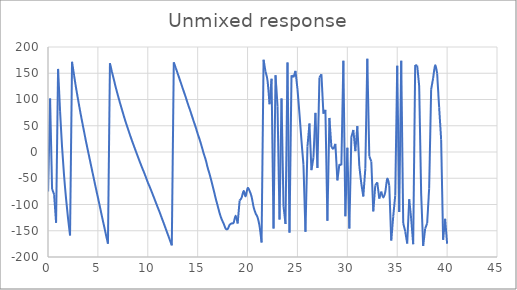
| Category | Series 0 |
|---|---|
| 0.01 | -75.169 |
| 0.20995 | 101.948 |
| 0.4099 | -70.43 |
| 0.60985 | -80.579 |
| 0.8098 | -134.649 |
| 1.00975 | 158.306 |
| 1.2097 | 77.784 |
| 1.40965 | 9.516 |
| 1.6096 | -44.796 |
| 1.80955 | -88.809 |
| 2.0095 | -126.266 |
| 2.20945 | -158.972 |
| 2.4094 | 171.735 |
| 2.60935 | 146.421 |
| 2.8093 | 122.249 |
| 3.00925 | 100.302 |
| 3.2092 | 78.877 |
| 3.40915 | 58.861 |
| 3.6091 | 39.356 |
| 3.80905 | 20.049 |
| 4.009 | 1.8 |
| 4.20895 | -16.251 |
| 4.4089 | -34.223 |
| 4.60885 | -52.158 |
| 4.8088 | -69.921 |
| 5.00875 | -87.151 |
| 5.2087 | -104.777 |
| 5.40865 | -122.88 |
| 5.6086 | -140.101 |
| 5.80855 | -157.591 |
| 6.0085 | -174.622 |
| 6.20845 | 169.105 |
| 6.4084 | 152.353 |
| 6.60835 | 137.323 |
| 6.8083 | 121.834 |
| 7.00825 | 107.657 |
| 7.2082 | 93.957 |
| 7.40815 | 80.986 |
| 7.6081 | 68.044 |
| 7.80805 | 55.735 |
| 8.008 | 44.467 |
| 8.20795 | 33.079 |
| 8.4079 | 22.021 |
| 8.60785 | 11.641 |
| 8.8078 | 1.257 |
| 9.00775 | -8.919 |
| 9.2077 | -18.989 |
| 9.40765 | -28.754 |
| 9.6076 | -38.073 |
| 9.80755 | -47.805 |
| 10.0075 | -58.156 |
| 10.20745 | -66.922 |
| 10.4074 | -76.525 |
| 10.60735 | -86.233 |
| 10.8073 | -96.168 |
| 11.00725 | -105.925 |
| 11.2072 | -115.559 |
| 11.40715 | -125.966 |
| 11.6071 | -136.059 |
| 11.80705 | -146.472 |
| 12.007 | -156.874 |
| 12.20695 | -167.329 |
| 12.4069 | -177.845 |
| 12.60685 | 170.76 |
| 12.8068 | 159.918 |
| 13.00675 | 149.038 |
| 13.2067 | 137.717 |
| 13.40665 | 126.603 |
| 13.6066 | 115.363 |
| 13.80655 | 104.161 |
| 14.0065 | 92.317 |
| 14.20645 | 81.318 |
| 14.4064 | 69.835 |
| 14.60635 | 58.293 |
| 14.8063 | 46.955 |
| 15.00625 | 34.525 |
| 15.2062 | 23.282 |
| 15.40615 | 10.515 |
| 15.6061 | -2.957 |
| 15.80605 | -14.964 |
| 16.006 | -30.083 |
| 16.20595 | -42.918 |
| 16.4059 | -57.417 |
| 16.60585 | -72.372 |
| 16.8058 | -88.347 |
| 17.00575 | -102.579 |
| 17.2057 | -116.837 |
| 17.40565 | -128.112 |
| 17.6056 | -136.37 |
| 17.80555 | -145.779 |
| 18.0055 | -146.702 |
| 18.20545 | -138.711 |
| 18.4054 | -136.02 |
| 18.60535 | -134.716 |
| 18.8053 | -121.333 |
| 19.00525 | -136.124 |
| 19.2052 | -92.446 |
| 19.40515 | -86.969 |
| 19.6051 | -74.136 |
| 19.80505 | -84.382 |
| 20.005 | -68.787 |
| 20.20495 | -74.247 |
| 20.4049 | -85.189 |
| 20.60485 | -104.761 |
| 20.8048 | -116.702 |
| 21.00475 | -124.47 |
| 21.2047 | -141.509 |
| 21.40465 | -172.284 |
| 21.6046 | 175.716 |
| 21.80455 | 152.621 |
| 22.0045 | 135.643 |
| 22.20445 | 90.979 |
| 22.4044 | 139.613 |
| 22.60435 | -145.886 |
| 22.8043 | 146.171 |
| 23.00425 | 87.138 |
| 23.2042 | -128.442 |
| 23.40415 | 101.741 |
| 23.6041 | -103.171 |
| 23.80405 | -137.142 |
| 24.004 | 170.621 |
| 24.20395 | -153.559 |
| 24.4039 | 146.002 |
| 24.60385 | 142.311 |
| 24.8038 | 154.51 |
| 25.00375 | 119.669 |
| 25.2037 | 72.466 |
| 25.40365 | 21.941 |
| 25.6036 | -24.643 |
| 25.80355 | -152.067 |
| 26.0035 | 10.258 |
| 26.20345 | 54.205 |
| 26.4034 | -34.576 |
| 26.60335 | -10.806 |
| 26.8033 | 74.548 |
| 27.00325 | -30.436 |
| 27.2032 | 141.813 |
| 27.40315 | 148.012 |
| 27.6031 | 72.932 |
| 27.80305 | 80.249 |
| 28.003 | -130.994 |
| 28.20295 | 64.947 |
| 28.4029 | 9.583 |
| 28.60285 | 5.224 |
| 28.8028 | 15.433 |
| 29.00275 | -54.107 |
| 29.2027 | -23.419 |
| 29.40265 | -25.194 |
| 29.6026 | 173.648 |
| 29.80255 | -122.295 |
| 30.0025 | 7.995 |
| 30.20245 | -145.853 |
| 30.4024 | 28.311 |
| 30.60235 | 42.03 |
| 30.8023 | 1.643 |
| 31.00225 | 49.232 |
| 31.2022 | -26.83 |
| 31.40215 | -60.003 |
| 31.6021 | -84.722 |
| 31.80205 | -31.656 |
| 32.002 | 177.691 |
| 32.20195 | -8.175 |
| 32.4019 | -18.097 |
| 32.60185 | -113.109 |
| 32.8018 | -63.636 |
| 33.00175 | -57.859 |
| 33.2017 | -88.776 |
| 33.40165 | -75.396 |
| 33.6016 | -86.596 |
| 33.80155 | -76.246 |
| 34.0015 | -50.96 |
| 34.20145 | -63.411 |
| 34.4014 | -168.692 |
| 34.60135 | -122.45 |
| 34.8013 | -82.559 |
| 35.00125 | 164.113 |
| 35.2012 | -114.223 |
| 35.40115 | 173.702 |
| 35.6011 | -135.395 |
| 35.80105 | -151.014 |
| 36.001 | -174.394 |
| 36.20095 | -89.874 |
| 36.4009 | -127.498 |
| 36.60085 | -175.518 |
| 36.8008 | 165.569 |
| 37.00075 | 164.803 |
| 37.2007 | 125.755 |
| 37.40065 | -80.062 |
| 37.6006 | -178.937 |
| 37.80055 | -145.947 |
| 38.0005 | -135.759 |
| 38.20045 | -68.982 |
| 38.4004 | 119.351 |
| 38.60035 | 140.753 |
| 38.8003 | 164.854 |
| 39.00025 | 150.025 |
| 39.2002 | 85.318 |
| 39.40015 | 24.484 |
| 39.6001 | -167.309 |
| 39.80005 | -127.286 |
| 40.0 | -174.635 |
| 40.0 | -174.635 |
| 40.0 | -174.635 |
| 40.0 | -174.635 |
| 40.0 | -174.635 |
| 40.0 | -174.635 |
| 40.0 | -174.635 |
| 40.0 | -174.635 |
| 40.0 | -174.635 |
| 40.0 | -174.635 |
| 40.0 | -174.635 |
| 40.0 | -174.635 |
| 40.0 | -174.635 |
| 40.0 | -174.635 |
| 40.0 | -174.635 |
| 40.0 | -174.635 |
| 40.0 | -174.635 |
| 40.0 | -174.635 |
| 40.0 | -174.635 |
| 40.0 | -174.635 |
| 40.0 | -174.635 |
| 40.0 | -174.635 |
| 40.0 | -174.635 |
| 40.0 | -174.635 |
| 40.0 | -174.635 |
| 40.0 | -174.635 |
| 40.0 | -174.635 |
| 40.0 | -174.635 |
| 40.0 | -174.635 |
| 40.0 | -174.635 |
| 40.0 | -174.635 |
| 40.0 | -174.635 |
| 40.0 | -174.635 |
| 40.0 | -174.635 |
| 40.0 | -174.635 |
| 40.0 | -174.635 |
| 40.0 | -174.635 |
| 40.0 | -174.635 |
| 40.0 | -174.635 |
| 40.0 | -174.635 |
| 40.0 | -174.635 |
| 40.0 | -174.635 |
| 40.0 | -174.635 |
| 40.0 | -174.635 |
| 40.0 | -174.635 |
| 40.0 | -174.635 |
| 40.0 | -174.635 |
| 40.0 | -174.635 |
| 40.0 | -174.635 |
| 40.0 | -174.635 |
| 40.0 | -174.635 |
| 40.0 | -174.635 |
| 40.0 | -174.635 |
| 40.0 | -174.635 |
| 40.0 | -174.635 |
| 40.0 | -174.635 |
| 40.0 | -174.635 |
| 40.0 | -174.635 |
| 40.0 | -174.635 |
| 40.0 | -174.635 |
| 40.0 | -174.635 |
| 40.0 | -174.635 |
| 40.0 | -174.635 |
| 40.0 | -174.635 |
| 40.0 | -174.635 |
| 40.0 | -174.635 |
| 40.0 | -174.635 |
| 40.0 | -174.635 |
| 40.0 | -174.635 |
| 40.0 | -174.635 |
| 40.0 | -174.635 |
| 40.0 | -174.635 |
| 40.0 | -174.635 |
| 40.0 | -174.635 |
| 40.0 | -174.635 |
| 40.0 | -174.635 |
| 40.0 | -174.635 |
| 40.0 | -174.635 |
| 40.0 | -174.635 |
| 40.0 | -174.635 |
| 40.0 | -174.635 |
| 40.0 | -174.635 |
| 40.0 | -174.635 |
| 40.0 | -174.635 |
| 40.0 | -174.635 |
| 40.0 | -174.635 |
| 40.0 | -174.635 |
| 40.0 | -174.635 |
| 40.0 | -174.635 |
| 40.0 | -174.635 |
| 40.0 | -174.635 |
| 40.0 | -174.635 |
| 40.0 | -174.635 |
| 40.0 | -174.635 |
| 40.0 | -174.635 |
| 40.0 | -174.635 |
| 40.0 | -174.635 |
| 40.0 | -174.635 |
| 40.0 | -174.635 |
| 40.0 | -174.635 |
| 40.0 | -174.635 |
| 40.0 | -174.635 |
| 40.0 | -174.635 |
| 40.0 | -174.635 |
| 40.0 | -174.635 |
| 40.0 | -174.635 |
| 40.0 | -174.635 |
| 40.0 | -174.635 |
| 40.0 | -174.635 |
| 40.0 | -174.635 |
| 40.0 | -174.635 |
| 40.0 | -174.635 |
| 40.0 | -174.635 |
| 40.0 | -174.635 |
| 40.0 | -174.635 |
| 40.0 | -174.635 |
| 40.0 | -174.635 |
| 40.0 | -174.635 |
| 40.0 | -174.635 |
| 40.0 | -174.635 |
| 40.0 | -174.635 |
| 40.0 | -174.635 |
| 40.0 | -174.635 |
| 40.0 | -174.635 |
| 40.0 | -174.635 |
| 40.0 | -174.635 |
| 40.0 | -174.635 |
| 40.0 | -174.635 |
| 40.0 | -174.635 |
| 40.0 | -174.635 |
| 40.0 | -174.635 |
| 40.0 | -174.635 |
| 40.0 | -174.635 |
| 40.0 | -174.635 |
| 40.0 | -174.635 |
| 40.0 | -174.635 |
| 40.0 | -174.635 |
| 40.0 | -174.635 |
| 40.0 | -174.635 |
| 40.0 | -174.635 |
| 40.0 | -174.635 |
| 40.0 | -174.635 |
| 40.0 | -174.635 |
| 40.0 | -174.635 |
| 40.0 | -174.635 |
| 40.0 | -174.635 |
| 40.0 | -174.635 |
| 40.0 | -174.635 |
| 40.0 | -174.635 |
| 40.0 | -174.635 |
| 40.0 | -174.635 |
| 40.0 | -174.635 |
| 40.0 | -174.635 |
| 40.0 | -174.635 |
| 40.0 | -174.635 |
| 40.0 | -174.635 |
| 40.0 | -174.635 |
| 40.0 | -174.635 |
| 40.0 | -174.635 |
| 40.0 | -174.635 |
| 40.0 | -174.635 |
| 40.0 | -174.635 |
| 40.0 | -174.635 |
| 40.0 | -174.635 |
| 40.0 | -174.635 |
| 40.0 | -174.635 |
| 40.0 | -174.635 |
| 40.0 | -174.635 |
| 40.0 | -174.635 |
| 40.0 | -174.635 |
| 40.0 | -174.635 |
| 40.0 | -174.635 |
| 40.0 | -174.635 |
| 40.0 | -174.635 |
| 40.0 | -174.635 |
| 40.0 | -174.635 |
| 40.0 | -174.635 |
| 40.0 | -174.635 |
| 40.0 | -174.635 |
| 40.0 | -174.635 |
| 40.0 | -174.635 |
| 40.0 | -174.635 |
| 40.0 | -174.635 |
| 40.0 | -174.635 |
| 40.0 | -174.635 |
| 40.0 | -174.635 |
| 40.0 | -174.635 |
| 40.0 | -174.635 |
| 40.0 | -174.635 |
| 40.0 | -174.635 |
| 40.0 | -174.635 |
| 40.0 | -174.635 |
| 40.0 | -174.635 |
| 40.0 | -174.635 |
| 40.0 | -174.635 |
| 40.0 | -174.635 |
| 40.0 | -174.635 |
| 40.0 | -174.635 |
| 40.0 | -174.635 |
| 40.0 | -174.635 |
| 40.0 | -174.635 |
| 40.0 | -174.635 |
| 40.0 | -174.635 |
| 40.0 | -174.635 |
| 40.0 | -174.635 |
| 40.0 | -174.635 |
| 40.0 | -174.635 |
| 40.0 | -174.635 |
| 40.0 | -174.635 |
| 40.0 | -174.635 |
| 40.0 | -174.635 |
| 40.0 | -174.635 |
| 40.0 | -174.635 |
| 40.0 | -174.635 |
| 40.0 | -174.635 |
| 40.0 | -174.635 |
| 40.0 | -174.635 |
| 40.0 | -174.635 |
| 40.0 | -174.635 |
| 40.0 | -174.635 |
| 40.0 | -174.635 |
| 40.0 | -174.635 |
| 40.0 | -174.635 |
| 40.0 | -174.635 |
| 40.0 | -174.635 |
| 40.0 | -174.635 |
| 40.0 | -174.635 |
| 40.0 | -174.635 |
| 40.0 | -174.635 |
| 40.0 | -174.635 |
| 40.0 | -174.635 |
| 40.0 | -174.635 |
| 40.0 | -174.635 |
| 40.0 | -174.635 |
| 40.0 | -174.635 |
| 40.0 | -174.635 |
| 40.0 | -174.635 |
| 40.0 | -174.635 |
| 40.0 | -174.635 |
| 40.0 | -174.635 |
| 40.0 | -174.635 |
| 40.0 | -174.635 |
| 40.0 | -174.635 |
| 40.0 | -174.635 |
| 40.0 | -174.635 |
| 40.0 | -174.635 |
| 40.0 | -174.635 |
| 40.0 | -174.635 |
| 40.0 | -174.635 |
| 40.0 | -174.635 |
| 40.0 | -174.635 |
| 40.0 | -174.635 |
| 40.0 | -174.635 |
| 40.0 | -174.635 |
| 40.0 | -174.635 |
| 40.0 | -174.635 |
| 40.0 | -174.635 |
| 40.0 | -174.635 |
| 40.0 | -174.635 |
| 40.0 | -174.635 |
| 40.0 | -174.635 |
| 40.0 | -174.635 |
| 40.0 | -174.635 |
| 40.0 | -174.635 |
| 40.0 | -174.635 |
| 40.0 | -174.635 |
| 40.0 | -174.635 |
| 40.0 | -174.635 |
| 40.0 | -174.635 |
| 40.0 | -174.635 |
| 40.0 | -174.635 |
| 40.0 | -174.635 |
| 40.0 | -174.635 |
| 40.0 | -174.635 |
| 40.0 | -174.635 |
| 40.0 | -174.635 |
| 40.0 | -174.635 |
| 40.0 | -174.635 |
| 40.0 | -174.635 |
| 40.0 | -174.635 |
| 40.0 | -174.635 |
| 40.0 | -174.635 |
| 40.0 | -174.635 |
| 40.0 | -174.635 |
| 40.0 | -174.635 |
| 40.0 | -174.635 |
| 40.0 | -174.635 |
| 40.0 | -174.635 |
| 40.0 | -174.635 |
| 40.0 | -174.635 |
| 40.0 | -174.635 |
| 40.0 | -174.635 |
| 40.0 | -174.635 |
| 40.0 | -174.635 |
| 40.0 | -174.635 |
| 40.0 | -174.635 |
| 40.0 | -174.635 |
| 40.0 | -174.635 |
| 40.0 | -174.635 |
| 40.0 | -174.635 |
| 40.0 | -174.635 |
| 40.0 | -174.635 |
| 40.0 | -174.635 |
| 40.0 | -174.635 |
| 40.0 | -174.635 |
| 40.0 | -174.635 |
| 40.0 | -174.635 |
| 40.0 | -174.635 |
| 40.0 | -174.635 |
| 40.0 | -174.635 |
| 40.0 | -174.635 |
| 40.0 | -174.635 |
| 40.0 | -174.635 |
| 40.0 | -174.635 |
| 40.0 | -174.635 |
| 40.0 | -174.635 |
| 40.0 | -174.635 |
| 40.0 | -174.635 |
| 40.0 | -174.635 |
| 40.0 | -174.635 |
| 40.0 | -174.635 |
| 40.0 | -174.635 |
| 40.0 | -174.635 |
| 40.0 | -174.635 |
| 40.0 | -174.635 |
| 40.0 | -174.635 |
| 40.0 | -174.635 |
| 40.0 | -174.635 |
| 40.0 | -174.635 |
| 40.0 | -174.635 |
| 40.0 | -174.635 |
| 40.0 | -174.635 |
| 40.0 | -174.635 |
| 40.0 | -174.635 |
| 40.0 | -174.635 |
| 40.0 | -174.635 |
| 40.0 | -174.635 |
| 40.0 | -174.635 |
| 40.0 | -174.635 |
| 40.0 | -174.635 |
| 40.0 | -174.635 |
| 40.0 | -174.635 |
| 40.0 | -174.635 |
| 40.0 | -174.635 |
| 40.0 | -174.635 |
| 40.0 | -174.635 |
| 40.0 | -174.635 |
| 40.0 | -174.635 |
| 40.0 | -174.635 |
| 40.0 | -174.635 |
| 40.0 | -174.635 |
| 40.0 | -174.635 |
| 40.0 | -174.635 |
| 40.0 | -174.635 |
| 40.0 | -174.635 |
| 40.0 | -174.635 |
| 40.0 | -174.635 |
| 40.0 | -174.635 |
| 40.0 | -174.635 |
| 40.0 | -174.635 |
| 40.0 | -174.635 |
| 40.0 | -174.635 |
| 40.0 | -174.635 |
| 40.0 | -174.635 |
| 40.0 | -174.635 |
| 40.0 | -174.635 |
| 40.0 | -174.635 |
| 40.0 | -174.635 |
| 40.0 | -174.635 |
| 40.0 | -174.635 |
| 40.0 | -174.635 |
| 40.0 | -174.635 |
| 40.0 | -174.635 |
| 40.0 | -174.635 |
| 40.0 | -174.635 |
| 40.0 | -174.635 |
| 40.0 | -174.635 |
| 40.0 | -174.635 |
| 40.0 | -174.635 |
| 40.0 | -174.635 |
| 40.0 | -174.635 |
| 40.0 | -174.635 |
| 40.0 | -174.635 |
| 40.0 | -174.635 |
| 40.0 | -174.635 |
| 40.0 | -174.635 |
| 40.0 | -174.635 |
| 40.0 | -174.635 |
| 40.0 | -174.635 |
| 40.0 | -174.635 |
| 40.0 | -174.635 |
| 40.0 | -174.635 |
| 40.0 | -174.635 |
| 40.0 | -174.635 |
| 40.0 | -174.635 |
| 40.0 | -174.635 |
| 40.0 | -174.635 |
| 40.0 | -174.635 |
| 40.0 | -174.635 |
| 40.0 | -174.635 |
| 40.0 | -174.635 |
| 40.0 | -174.635 |
| 40.0 | -174.635 |
| 40.0 | -174.635 |
| 40.0 | -174.635 |
| 40.0 | -174.635 |
| 40.0 | -174.635 |
| 40.0 | -174.635 |
| 40.0 | -174.635 |
| 40.0 | -174.635 |
| 40.0 | -174.635 |
| 40.0 | -174.635 |
| 40.0 | -174.635 |
| 40.0 | -174.635 |
| 40.0 | -174.635 |
| 40.0 | -174.635 |
| 40.0 | -174.635 |
| 40.0 | -174.635 |
| 40.0 | -174.635 |
| 40.0 | -174.635 |
| 40.0 | -174.635 |
| 40.0 | -174.635 |
| 40.0 | -174.635 |
| 40.0 | -174.635 |
| 40.0 | -174.635 |
| 40.0 | -174.635 |
| 40.0 | -174.635 |
| 40.0 | -174.635 |
| 40.0 | -174.635 |
| 40.0 | -174.635 |
| 40.0 | -174.635 |
| 40.0 | -174.635 |
| 40.0 | -174.635 |
| 40.0 | -174.635 |
| 40.0 | -174.635 |
| 40.0 | -174.635 |
| 40.0 | -174.635 |
| 40.0 | -174.635 |
| 40.0 | -174.635 |
| 40.0 | -174.635 |
| 40.0 | -174.635 |
| 40.0 | -174.635 |
| 40.0 | -174.635 |
| 40.0 | -174.635 |
| 40.0 | -174.635 |
| 40.0 | -174.635 |
| 40.0 | -174.635 |
| 40.0 | -174.635 |
| 40.0 | -174.635 |
| 40.0 | -174.635 |
| 40.0 | -174.635 |
| 40.0 | -174.635 |
| 40.0 | -174.635 |
| 40.0 | -174.635 |
| 40.0 | -174.635 |
| 40.0 | -174.635 |
| 40.0 | -174.635 |
| 40.0 | -174.635 |
| 40.0 | -174.635 |
| 40.0 | -174.635 |
| 40.0 | -174.635 |
| 40.0 | -174.635 |
| 40.0 | -174.635 |
| 40.0 | -174.635 |
| 40.0 | -174.635 |
| 40.0 | -174.635 |
| 40.0 | -174.635 |
| 40.0 | -174.635 |
| 40.0 | -174.635 |
| 40.0 | -174.635 |
| 40.0 | -174.635 |
| 40.0 | -174.635 |
| 40.0 | -174.635 |
| 40.0 | -174.635 |
| 40.0 | -174.635 |
| 40.0 | -174.635 |
| 40.0 | -174.635 |
| 40.0 | -174.635 |
| 40.0 | -174.635 |
| 40.0 | -174.635 |
| 40.0 | -174.635 |
| 40.0 | -174.635 |
| 40.0 | -174.635 |
| 40.0 | -174.635 |
| 40.0 | -174.635 |
| 40.0 | -174.635 |
| 40.0 | -174.635 |
| 40.0 | -174.635 |
| 40.0 | -174.635 |
| 40.0 | -174.635 |
| 40.0 | -174.635 |
| 40.0 | -174.635 |
| 40.0 | -174.635 |
| 40.0 | -174.635 |
| 40.0 | -174.635 |
| 40.0 | -174.635 |
| 40.0 | -174.635 |
| 40.0 | -174.635 |
| 40.0 | -174.635 |
| 40.0 | -174.635 |
| 40.0 | -174.635 |
| 40.0 | -174.635 |
| 40.0 | -174.635 |
| 40.0 | -174.635 |
| 40.0 | -174.635 |
| 40.0 | -174.635 |
| 40.0 | -174.635 |
| 40.0 | -174.635 |
| 40.0 | -174.635 |
| 40.0 | -174.635 |
| 40.0 | -174.635 |
| 40.0 | -174.635 |
| 40.0 | -174.635 |
| 40.0 | -174.635 |
| 40.0 | -174.635 |
| 40.0 | -174.635 |
| 40.0 | -174.635 |
| 40.0 | -174.635 |
| 40.0 | -174.635 |
| 40.0 | -174.635 |
| 40.0 | -174.635 |
| 40.0 | -174.635 |
| 40.0 | -174.635 |
| 40.0 | -174.635 |
| 40.0 | -174.635 |
| 40.0 | -174.635 |
| 40.0 | -174.635 |
| 40.0 | -174.635 |
| 40.0 | -174.635 |
| 40.0 | -174.635 |
| 40.0 | -174.635 |
| 40.0 | -174.635 |
| 40.0 | -174.635 |
| 40.0 | -174.635 |
| 40.0 | -174.635 |
| 40.0 | -174.635 |
| 40.0 | -174.635 |
| 40.0 | -174.635 |
| 40.0 | -174.635 |
| 40.0 | -174.635 |
| 40.0 | -174.635 |
| 40.0 | -174.635 |
| 40.0 | -174.635 |
| 40.0 | -174.635 |
| 40.0 | -174.635 |
| 40.0 | -174.635 |
| 40.0 | -174.635 |
| 40.0 | -174.635 |
| 40.0 | -174.635 |
| 40.0 | -174.635 |
| 40.0 | -174.635 |
| 40.0 | -174.635 |
| 40.0 | -174.635 |
| 40.0 | -174.635 |
| 40.0 | -174.635 |
| 40.0 | -174.635 |
| 40.0 | -174.635 |
| 40.0 | -174.635 |
| 40.0 | -174.635 |
| 40.0 | -174.635 |
| 40.0 | -174.635 |
| 40.0 | -174.635 |
| 40.0 | -174.635 |
| 40.0 | -174.635 |
| 40.0 | -174.635 |
| 40.0 | -174.635 |
| 40.0 | -174.635 |
| 40.0 | -174.635 |
| 40.0 | -174.635 |
| 40.0 | -174.635 |
| 40.0 | -174.635 |
| 40.0 | -174.635 |
| 40.0 | -174.635 |
| 40.0 | -174.635 |
| 40.0 | -174.635 |
| 40.0 | -174.635 |
| 40.0 | -174.635 |
| 40.0 | -174.635 |
| 40.0 | -174.635 |
| 40.0 | -174.635 |
| 40.0 | -174.635 |
| 40.0 | -174.635 |
| 40.0 | -174.635 |
| 40.0 | -174.635 |
| 40.0 | -174.635 |
| 40.0 | -174.635 |
| 40.0 | -174.635 |
| 40.0 | -174.635 |
| 40.0 | -174.635 |
| 40.0 | -174.635 |
| 40.0 | -174.635 |
| 40.0 | -174.635 |
| 40.0 | -174.635 |
| 40.0 | -174.635 |
| 40.0 | -174.635 |
| 40.0 | -174.635 |
| 40.0 | -174.635 |
| 40.0 | -174.635 |
| 40.0 | -174.635 |
| 40.0 | -174.635 |
| 40.0 | -174.635 |
| 40.0 | -174.635 |
| 40.0 | -174.635 |
| 40.0 | -174.635 |
| 40.0 | -174.635 |
| 40.0 | -174.635 |
| 40.0 | -174.635 |
| 40.0 | -174.635 |
| 40.0 | -174.635 |
| 40.0 | -174.635 |
| 40.0 | -174.635 |
| 40.0 | -174.635 |
| 40.0 | -174.635 |
| 40.0 | -174.635 |
| 40.0 | -174.635 |
| 40.0 | -174.635 |
| 40.0 | -174.635 |
| 40.0 | -174.635 |
| 40.0 | -174.635 |
| 40.0 | -174.635 |
| 40.0 | -174.635 |
| 40.0 | -174.635 |
| 40.0 | -174.635 |
| 40.0 | -174.635 |
| 40.0 | -174.635 |
| 40.0 | -174.635 |
| 40.0 | -174.635 |
| 40.0 | -174.635 |
| 40.0 | -174.635 |
| 40.0 | -174.635 |
| 40.0 | -174.635 |
| 40.0 | -174.635 |
| 40.0 | -174.635 |
| 40.0 | -174.635 |
| 40.0 | -174.635 |
| 40.0 | -174.635 |
| 40.0 | -174.635 |
| 40.0 | -174.635 |
| 40.0 | -174.635 |
| 40.0 | -174.635 |
| 40.0 | -174.635 |
| 40.0 | -174.635 |
| 40.0 | -174.635 |
| 40.0 | -174.635 |
| 40.0 | -174.635 |
| 40.0 | -174.635 |
| 40.0 | -174.635 |
| 40.0 | -174.635 |
| 40.0 | -174.635 |
| 40.0 | -174.635 |
| 40.0 | -174.635 |
| 40.0 | -174.635 |
| 40.0 | -174.635 |
| 40.0 | -174.635 |
| 40.0 | -174.635 |
| 40.0 | -174.635 |
| 40.0 | -174.635 |
| 40.0 | -174.635 |
| 40.0 | -174.635 |
| 40.0 | -174.635 |
| 40.0 | -174.635 |
| 40.0 | -174.635 |
| 40.0 | -174.635 |
| 40.0 | -174.635 |
| 40.0 | -174.635 |
| 40.0 | -174.635 |
| 40.0 | -174.635 |
| 40.0 | -174.635 |
| 40.0 | -174.635 |
| 40.0 | -174.635 |
| 40.0 | -174.635 |
| 40.0 | -174.635 |
| 40.0 | -174.635 |
| 40.0 | -174.635 |
| 40.0 | -174.635 |
| 40.0 | -174.635 |
| 40.0 | -174.635 |
| 40.0 | -174.635 |
| 40.0 | -174.635 |
| 40.0 | -174.635 |
| 40.0 | -174.635 |
| 40.0 | -174.635 |
| 40.0 | -174.635 |
| 40.0 | -174.635 |
| 40.0 | -174.635 |
| 40.0 | -174.635 |
| 40.0 | -174.635 |
| 40.0 | -174.635 |
| 40.0 | -174.635 |
| 40.0 | -174.635 |
| 40.0 | -174.635 |
| 40.0 | -174.635 |
| 40.0 | -174.635 |
| 40.0 | -174.635 |
| 40.0 | -174.635 |
| 40.0 | -174.635 |
| 40.0 | -174.635 |
| 40.0 | -174.635 |
| 40.0 | -174.635 |
| 40.0 | -174.635 |
| 40.0 | -174.635 |
| 40.0 | -174.635 |
| 40.0 | -174.635 |
| 40.0 | -174.635 |
| 40.0 | -174.635 |
| 40.0 | -174.635 |
| 40.0 | -174.635 |
| 40.0 | -174.635 |
| 40.0 | -174.635 |
| 40.0 | -174.635 |
| 40.0 | -174.635 |
| 40.0 | -174.635 |
| 40.0 | -174.635 |
| 40.0 | -174.635 |
| 40.0 | -174.635 |
| 40.0 | -174.635 |
| 40.0 | -174.635 |
| 40.0 | -174.635 |
| 40.0 | -174.635 |
| 40.0 | -174.635 |
| 40.0 | -174.635 |
| 40.0 | -174.635 |
| 40.0 | -174.635 |
| 40.0 | -174.635 |
| 40.0 | -174.635 |
| 40.0 | -174.635 |
| 40.0 | -174.635 |
| 40.0 | -174.635 |
| 40.0 | -174.635 |
| 40.0 | -174.635 |
| 40.0 | -174.635 |
| 40.0 | -174.635 |
| 40.0 | -174.635 |
| 40.0 | -174.635 |
| 40.0 | -174.635 |
| 40.0 | -174.635 |
| 40.0 | -174.635 |
| 40.0 | -174.635 |
| 40.0 | -174.635 |
| 40.0 | -174.635 |
| 40.0 | -174.635 |
| 40.0 | -174.635 |
| 40.0 | -174.635 |
| 40.0 | -174.635 |
| 40.0 | -174.635 |
| 40.0 | -174.635 |
| 40.0 | -174.635 |
| 40.0 | -174.635 |
| 40.0 | -174.635 |
| 40.0 | -174.635 |
| 40.0 | -174.635 |
| 40.0 | -174.635 |
| 40.0 | -174.635 |
| 40.0 | -174.635 |
| 40.0 | -174.635 |
| 40.0 | -174.635 |
| 40.0 | -174.635 |
| 40.0 | -174.635 |
| 40.0 | -174.635 |
| 40.0 | -174.635 |
| 40.0 | -174.635 |
| 40.0 | -174.635 |
| 40.0 | -174.635 |
| 40.0 | -174.635 |
| 40.0 | -174.635 |
| 40.0 | -174.635 |
| 40.0 | -174.635 |
| 40.0 | -174.635 |
| 40.0 | -174.635 |
| 40.0 | -174.635 |
| 40.0 | -174.635 |
| 40.0 | -174.635 |
| 40.0 | -174.635 |
| 40.0 | -174.635 |
| 40.0 | -174.635 |
| 40.0 | -174.635 |
| 40.0 | -174.635 |
| 40.0 | -174.635 |
| 40.0 | -174.635 |
| 40.0 | -174.635 |
| 40.0 | -174.635 |
| 40.0 | -174.635 |
| 40.0 | -174.635 |
| 40.0 | -174.635 |
| 40.0 | -174.635 |
| 40.0 | -174.635 |
| 40.0 | -174.635 |
| 40.0 | -174.635 |
| 40.0 | -174.635 |
| 40.0 | -174.635 |
| 40.0 | -174.635 |
| 40.0 | -174.635 |
| 40.0 | -174.635 |
| 40.0 | -174.635 |
| 40.0 | -174.635 |
| 40.0 | -174.635 |
| 40.0 | -174.635 |
| 40.0 | -174.635 |
| 40.0 | -174.635 |
| 40.0 | -174.635 |
| 40.0 | -174.635 |
| 40.0 | -174.635 |